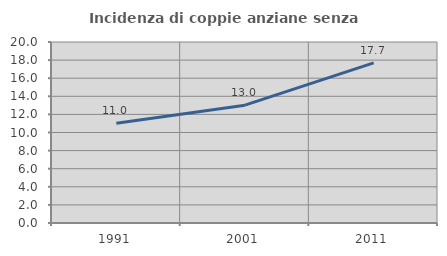
| Category | Incidenza di coppie anziane senza figli  |
|---|---|
| 1991.0 | 11.015 |
| 2001.0 | 13.021 |
| 2011.0 | 17.694 |